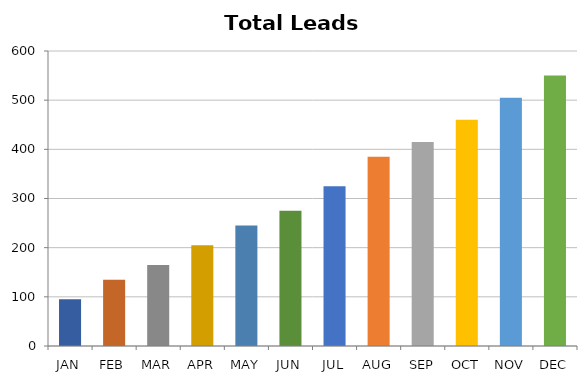
| Category | Total |
|---|---|
| JAN | 95 |
| FEB | 135 |
| MAR | 165 |
| APR | 205 |
| MAY | 245 |
| JUN | 275 |
| JUL | 325 |
| AUG | 385 |
| SEP | 415 |
| OCT | 460 |
| NOV | 505 |
| DEC | 550 |